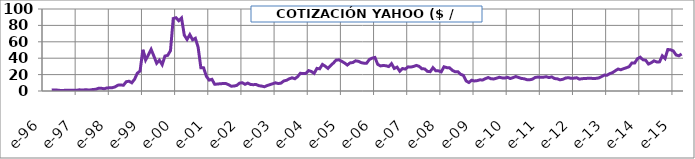
| Category | COTIZACIÓN YAHOO ($ / ACCIÓN) |
|---|---|
| 1996-04-12 | 1.375 |
| 1996-05-12 | 1.302 |
| 1996-06-12 | 1.083 |
| 1996-07-12 | 0.729 |
| 1996-08-12 | 0.719 |
| 1996-09-12 | 0.812 |
| 1996-10-12 | 0.859 |
| 1996-11-12 | 0.823 |
| 1996-12-12 | 0.833 |
| 1997-01-12 | 0.802 |
| 1997-02-12 | 1.484 |
| 1997-03-12 | 1.068 |
| 1997-04-12 | 1.43 |
| 1997-05-12 | 1.365 |
| 1997-06-12 | 1.333 |
| 1997-07-12 | 1.833 |
| 1997-08-12 | 2.122 |
| 1997-09-12 | 3.371 |
| 1997-10-12 | 3.301 |
| 1997-11-12 | 2.719 |
| 1997-12-12 | 3.719 |
| 1998-01-12 | 3.906 |
| 1998-02-12 | 4.07 |
| 1998-03-12 | 5.125 |
| 1998-04-12 | 7.156 |
| 1998-05-12 | 7.23 |
| 1998-06-12 | 7.113 |
| 1998-07-12 | 11.328 |
| 1998-08-12 | 11.922 |
| 1998-09-12 | 9.984 |
| 1998-10-12 | 14.305 |
| 1998-11-12 | 21.656 |
| 1998-12-12 | 24.461 |
| 1999-01-12 | 50.25 |
| 1999-02-12 | 37.75 |
| 1999-03-12 | 44 |
| 1999-04-12 | 50.734 |
| 1999-05-12 | 42.484 |
| 1999-06-12 | 33.812 |
| 1999-07-12 | 37.562 |
| 1999-08-12 | 32.094 |
| 1999-09-12 | 42.625 |
| 1999-10-12 | 43.469 |
| 1999-11-12 | 49.234 |
| 1999-12-12 | 88.375 |
| 2000-01-12 | 89.391 |
| 2000-02-12 | 85.672 |
| 2000-03-12 | 89.031 |
| 2000-04-12 | 68.094 |
| 2000-05-12 | 62.844 |
| 2000-06-12 | 68.719 |
| 2000-07-12 | 62.469 |
| 2000-08-12 | 64.312 |
| 2000-09-12 | 53.5 |
| 2000-10-12 | 28.312 |
| 2000-11-12 | 28.219 |
| 2000-12-12 | 17.906 |
| 2001-01-12 | 13.281 |
| 2001-02-12 | 14.25 |
| 2001-03-12 | 8.188 |
| 2001-04-12 | 8.48 |
| 2001-05-12 | 8.895 |
| 2001-06-12 | 9.055 |
| 2001-07-12 | 9.13 |
| 2001-08-12 | 7.71 |
| 2001-09-12 | 5.87 |
| 2001-10-12 | 6.04 |
| 2001-11-12 | 6.85 |
| 2001-12-12 | 9.57 |
| 2002-01-12 | 10.08 |
| 2002-02-12 | 8.165 |
| 2002-03-12 | 9.68 |
| 2002-04-12 | 7.86 |
| 2002-05-12 | 7.73 |
| 2002-06-12 | 7.915 |
| 2002-07-12 | 6.47 |
| 2002-08-12 | 5.985 |
| 2002-09-12 | 5.175 |
| 2002-10-12 | 6.68 |
| 2002-11-12 | 7.74 |
| 2002-12-12 | 8.815 |
| 2003-01-12 | 10 |
| 2003-02-12 | 9.085 |
| 2003-03-12 | 9.595 |
| 2003-04-12 | 12.215 |
| 2003-05-12 | 13.085 |
| 2003-06-12 | 14.85 |
| 2003-07-12 | 16.095 |
| 2003-08-12 | 14.925 |
| 2003-09-12 | 17.41 |
| 2003-10-12 | 21.58 |
| 2003-11-12 | 21.265 |
| 2003-12-12 | 21.49 |
| 2004-01-12 | 24.87 |
| 2004-02-12 | 23.76 |
| 2004-03-12 | 21.51 |
| 2004-04-12 | 27.57 |
| 2004-05-12 | 27.08 |
| 2004-06-12 | 32.4 |
| 2004-07-12 | 30.26 |
| 2004-08-12 | 27.55 |
| 2004-09-12 | 31.08 |
| 2004-10-12 | 34.23 |
| 2004-11-12 | 37.8 |
| 2004-12-12 | 38.02 |
| 2005-01-12 | 36.14 |
| 2005-02-12 | 34.15 |
| 2005-03-12 | 31.65 |
| 2005-04-12 | 34.28 |
| 2005-05-12 | 34.71 |
| 2005-06-12 | 36.81 |
| 2005-07-12 | 36.23 |
| 2005-08-12 | 34.6 |
| 2005-09-12 | 33.91 |
| 2005-10-12 | 33.93 |
| 2005-11-12 | 38.49 |
| 2005-12-12 | 40.08 |
| 2006-01-12 | 40.89 |
| 2006-02-12 | 32.51 |
| 2006-03-12 | 30.58 |
| 2006-04-12 | 31.1 |
| 2006-05-12 | 30.81 |
| 2006-06-12 | 29.78 |
| 2006-07-12 | 33.38 |
| 2006-08-12 | 27.5 |
| 2006-09-12 | 29.09 |
| 2006-10-12 | 24.12 |
| 2006-11-12 | 27.39 |
| 2006-12-12 | 26.75 |
| 2007-01-12 | 29.45 |
| 2007-02-12 | 29.17 |
| 2007-03-12 | 29.99 |
| 2007-04-12 | 31.21 |
| 2007-05-12 | 30.05 |
| 2007-06-12 | 27.05 |
| 2007-07-12 | 26.96 |
| 2007-08-12 | 23.94 |
| 2007-09-12 | 23.56 |
| 2007-10-12 | 28.48 |
| 2007-11-12 | 24.78 |
| 2007-12-12 | 24.54 |
| 2008-01-12 | 23.36 |
| 2008-02-12 | 29.57 |
| 2008-03-12 | 28.45 |
| 2008-04-12 | 28.34 |
| 2008-05-12 | 25.26 |
| 2008-06-12 | 23.52 |
| 2008-07-12 | 23.57 |
| 2008-08-12 | 20.43 |
| 2008-09-12 | 19.08 |
| 2008-10-12 | 12.29 |
| 2008-11-12 | 10.34 |
| 2008-12-12 | 13.15 |
| 2009-01-12 | 12.22 |
| 2009-02-12 | 12.66 |
| 2009-03-12 | 13.6 |
| 2009-04-12 | 13.47 |
| 2009-05-12 | 15.1 |
| 2009-06-12 | 16.4 |
| 2009-07-12 | 14.93 |
| 2009-08-12 | 14.68 |
| 2009-09-12 | 15.59 |
| 2009-10-12 | 16.75 |
| 2009-11-12 | 16 |
| 2009-12-12 | 15.74 |
| 2010-01-12 | 16.68 |
| 2010-02-12 | 15.17 |
| 2010-03-12 | 16.32 |
| 2010-04-12 | 17.64 |
| 2010-05-12 | 16.47 |
| 2010-06-12 | 15.29 |
| 2010-07-12 | 14.94 |
| 2010-08-12 | 13.85 |
| 2010-09-12 | 13.68 |
| 2010-10-12 | 14.43 |
| 2010-11-12 | 16.55 |
| 2010-12-12 | 17.01 |
| 2011-01-12 | 16.65 |
| 2011-02-12 | 16.85 |
| 2011-03-12 | 17.42 |
| 2011-04-12 | 16.36 |
| 2011-05-12 | 17.17 |
| 2011-06-12 | 15.2 |
| 2011-07-12 | 14.86 |
| 2011-08-12 | 13.585 |
| 2011-09-12 | 14.26 |
| 2011-10-12 | 15.77 |
| 2011-11-12 | 16.27 |
| 2011-12-12 | 15.47 |
| 2012-01-12 | 15.66 |
| 2012-02-12 | 16.14 |
| 2012-03-12 | 14.49 |
| 2012-04-12 | 15.055 |
| 2012-05-12 | 15.19 |
| 2012-06-12 | 15.47 |
| 2012-07-12 | 15.69 |
| 2012-08-12 | 15.15 |
| 2012-09-12 | 15.4 |
| 2012-10-12 | 15.88 |
| 2012-11-12 | 17.51 |
| 2012-12-12 | 19.38 |
| 2013-01-12 | 19.29 |
| 2013-02-12 | 21.21 |
| 2013-03-12 | 22.4 |
| 2013-04-12 | 24.69 |
| 2013-05-12 | 26.83 |
| 2013-06-12 | 25.89 |
| 2013-07-12 | 27.23 |
| 2013-08-12 | 28.35 |
| 2013-09-12 | 29.65 |
| 2013-10-12 | 34.15 |
| 2013-11-12 | 34.07 |
| 2013-12-12 | 39.35 |
| 2014-01-12 | 41.23 |
| 2014-02-12 | 38.11 |
| 2014-03-12 | 37.5 |
| 2014-04-12 | 32.868 |
| 2014-05-12 | 34.45 |
| 2014-06-12 | 36.78 |
| 2014-07-12 | 35.43 |
| 2014-08-12 | 35.52 |
| 2014-09-12 | 42.88 |
| 2014-10-12 | 39.6 |
| 2014-11-12 | 50.6 |
| 2014-12-12 | 50.24 |
| 2015-01-12 | 48.8 |
| 2015-02-12 | 43.925 |
| 2015-03-12 | 42.95 |
| 2015-04-12 | 45.18 |